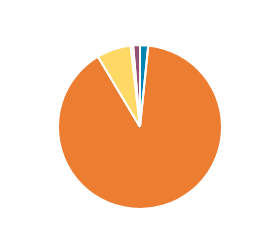
| Category | Series 0 |
|---|---|
|  | 1440 |
|  | 80331 |
|  | 6045 |
|  | 443 |
|  | 1194 |